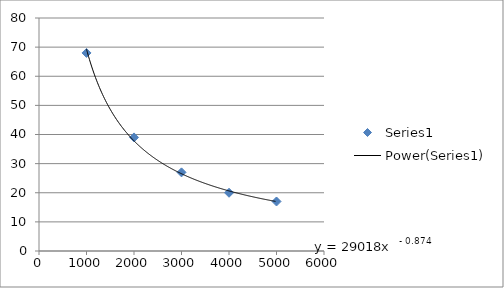
| Category | Series 0 |
|---|---|
| 1000.0 | 68 |
| 2000.0 | 39 |
| 3000.0 | 27 |
| 4000.0 | 20 |
| 5000.0 | 17 |